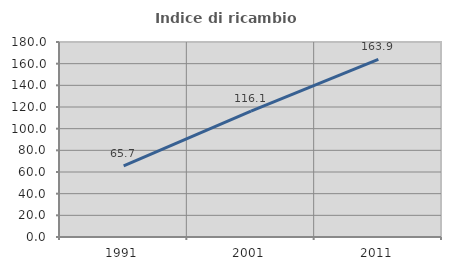
| Category | Indice di ricambio occupazionale  |
|---|---|
| 1991.0 | 65.749 |
| 2001.0 | 116.116 |
| 2011.0 | 163.95 |